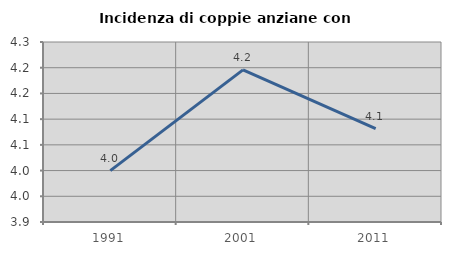
| Category | Incidenza di coppie anziane con figli |
|---|---|
| 1991.0 | 4 |
| 2001.0 | 4.196 |
| 2011.0 | 4.082 |